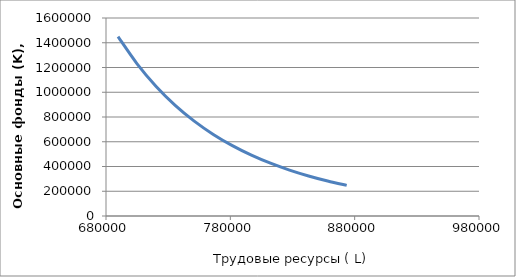
| Category | Series 0 |
|---|---|
| 689670.0 | 1449587.229 |
| 704996.0 | 1229971.192 |
| 720322.0 | 1047321.552 |
| 735648.0 | 894818.674 |
| 750974.0 | 767006.975 |
| 766300.0 | 659501.697 |
| 781626.0 | 568762.938 |
| 796952.0 | 491920.571 |
| 812278.0 | 426637.911 |
| 827604.0 | 371005.012 |
| 842930.0000000001 | 323454.771 |
| 858256.0000000001 | 282696.655 |
| 873581.9999999999 | 247664.126 |